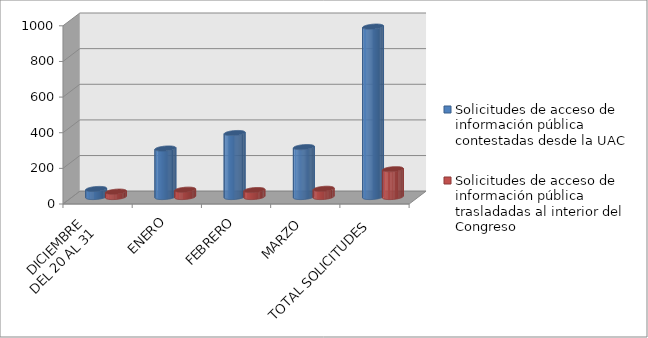
| Category | Solicitudes de acceso de información pública contestadas desde la UAC | Solicitudes de acceso de información pública trasladadas al interior del Congreso |
|---|---|---|
| DICIEMBRE 
DEL 20 AL 31 | 45 | 30 |
| ENERO | 272 | 41 |
| FEBRERO | 359 | 39 |
| MARZO | 280 | 46 |
| TOTAL SOLICITUDES | 956 | 156 |